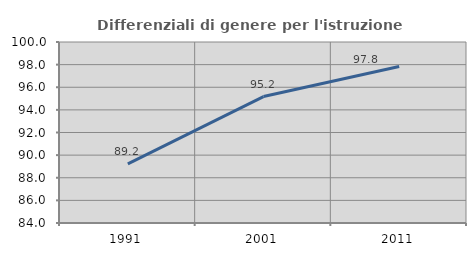
| Category | Differenziali di genere per l'istruzione superiore |
|---|---|
| 1991.0 | 89.228 |
| 2001.0 | 95.176 |
| 2011.0 | 97.827 |